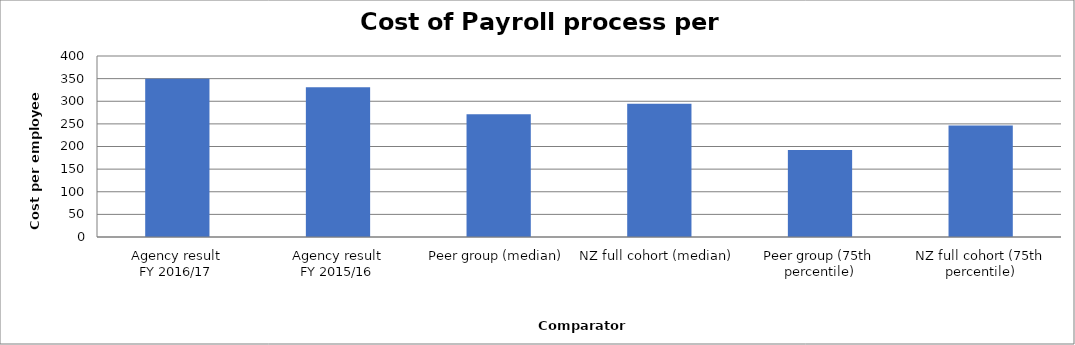
| Category | Result |
|---|---|
| Agency result
FY 2016/17 | 349.519 |
| Agency result
FY 2015/16 | 330.685 |
| Peer group (median) | 271.189 |
| NZ full cohort (median) | 294.616 |
| Peer group (75th percentile) | 192.399 |
| NZ full cohort (75th percentile) | 246.371 |